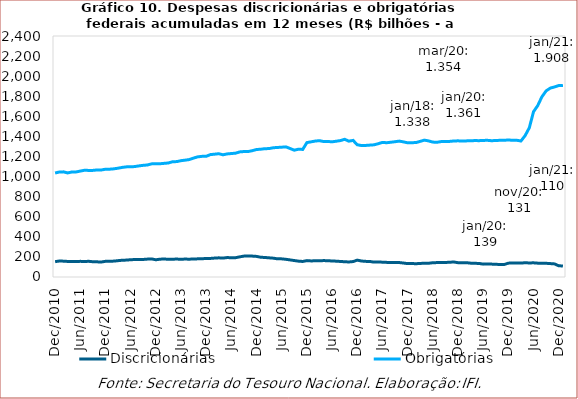
| Category | Discricionárias | Obrigatórias |
|---|---|---|
| 2010-12-01 | 152493.078 | 1035611.279 |
| 2011-01-01 | 159361.347 | 1045466.51 |
| 2011-02-01 | 157772.282 | 1047000.914 |
| 2011-03-01 | 154988.34 | 1036507.236 |
| 2011-04-01 | 155411.719 | 1045882.444 |
| 2011-05-01 | 153684.758 | 1046263.709 |
| 2011-06-01 | 155844.777 | 1054910.131 |
| 2011-07-01 | 154352.519 | 1062718.355 |
| 2011-08-01 | 156264.738 | 1061507.962 |
| 2011-09-01 | 151985.253 | 1061675.842 |
| 2011-10-01 | 150957.055 | 1066053.446 |
| 2011-11-01 | 149219.391 | 1065449.513 |
| 2011-12-01 | 156296.456 | 1073489.223 |
| 2012-01-01 | 157255.637 | 1073674.89 |
| 2012-02-01 | 158217.53 | 1077167.106 |
| 2012-03-01 | 162676.42 | 1083446.814 |
| 2012-04-01 | 166902.656 | 1091550.693 |
| 2012-05-01 | 168341.866 | 1096842.513 |
| 2012-06-01 | 172020.942 | 1097212.478 |
| 2012-07-01 | 174046.364 | 1099840.94 |
| 2012-08-01 | 175037.639 | 1106603.985 |
| 2012-09-01 | 174729.711 | 1112021.899 |
| 2012-10-01 | 178167.072 | 1115761.085 |
| 2012-11-01 | 180190.611 | 1126600.033 |
| 2012-12-01 | 171610.037 | 1126668.014 |
| 2013-01-01 | 177393.075 | 1127914.118 |
| 2013-02-01 | 179446.379 | 1131786.408 |
| 2013-03-01 | 176042.849 | 1135689.229 |
| 2013-04-01 | 177418.997 | 1147931.016 |
| 2013-05-01 | 178486.377 | 1149229.244 |
| 2013-06-01 | 176769.881 | 1158483.89 |
| 2013-07-01 | 178600.591 | 1163665.494 |
| 2013-08-01 | 177329.815 | 1169685.257 |
| 2013-09-01 | 179660.759 | 1184481.561 |
| 2013-10-01 | 180677.71 | 1196709.253 |
| 2013-11-01 | 182110.259 | 1201426.099 |
| 2013-12-01 | 184118.512 | 1201795.875 |
| 2014-01-01 | 184882.54 | 1218985.435 |
| 2014-02-01 | 188479.526 | 1222987.188 |
| 2014-03-01 | 190788.251 | 1227545.058 |
| 2014-04-01 | 188549.096 | 1217009.808 |
| 2014-05-01 | 193561.09 | 1225624.041 |
| 2014-06-01 | 191831.298 | 1229446.183 |
| 2014-07-01 | 192482.173 | 1233089.87 |
| 2014-08-01 | 200764.952 | 1245831.885 |
| 2014-09-01 | 207888.291 | 1249446.674 |
| 2014-10-01 | 208474.059 | 1249594.489 |
| 2014-11-01 | 208084.839 | 1258131.577 |
| 2014-12-01 | 205151.903 | 1269584.343 |
| 2015-01-01 | 196693.267 | 1272368.092 |
| 2015-02-01 | 194304.511 | 1277905.287 |
| 2015-03-01 | 190862.755 | 1278848.919 |
| 2015-04-01 | 187517.102 | 1287211.532 |
| 2015-05-01 | 180905.173 | 1290063.781 |
| 2015-06-01 | 180512.281 | 1292767.999 |
| 2015-07-01 | 176312.271 | 1295859.857 |
| 2015-08-01 | 170151.429 | 1279608.895 |
| 2015-09-01 | 163711.776 | 1262648.181 |
| 2015-10-01 | 157811.914 | 1272912.369 |
| 2015-11-01 | 154748.477 | 1270338.719 |
| 2015-12-01 | 163198.564 | 1338455.826 |
| 2016-01-01 | 160189.151 | 1346033.944 |
| 2016-02-01 | 161222.291 | 1353785.99 |
| 2016-03-01 | 161347.554 | 1357665.365 |
| 2016-04-01 | 163491.412 | 1348828.399 |
| 2016-05-01 | 161939.579 | 1349523.096 |
| 2016-06-01 | 159600.888 | 1346313.987 |
| 2016-07-01 | 157643.081 | 1352373.142 |
| 2016-08-01 | 154775.481 | 1358535.29 |
| 2016-09-01 | 151854.93 | 1371460.716 |
| 2016-10-01 | 149809.693 | 1352555.736 |
| 2016-11-01 | 153647.855 | 1360372.963 |
| 2016-12-01 | 167704.843 | 1317148.731 |
| 2017-01-01 | 159096.618 | 1309003.336 |
| 2017-02-01 | 155694.532 | 1310138.762 |
| 2017-03-01 | 154485.984 | 1313483.545 |
| 2017-04-01 | 148237.999 | 1316237.311 |
| 2017-05-01 | 149123.925 | 1327415.808 |
| 2017-06-01 | 147814.637 | 1340471.242 |
| 2017-07-01 | 145641.095 | 1337141.482 |
| 2017-08-01 | 145402.246 | 1341982.796 |
| 2017-09-01 | 144549.956 | 1347246.439 |
| 2017-10-01 | 143794.786 | 1353184.796 |
| 2017-11-01 | 138996.002 | 1345668.118 |
| 2017-12-01 | 133452.992 | 1336328.094 |
| 2018-01-01 | 133934.731 | 1337759.638 |
| 2018-02-01 | 132476.088 | 1338577.609 |
| 2018-03-01 | 134669.899 | 1350730.396 |
| 2018-04-01 | 137802.22 | 1362986.37 |
| 2018-05-01 | 136899.41 | 1355086.034 |
| 2018-06-01 | 142060.347 | 1343446.351 |
| 2018-07-01 | 143448.771 | 1341825.247 |
| 2018-08-01 | 143618.57 | 1348581.299 |
| 2018-09-01 | 144610.42 | 1349785.261 |
| 2018-10-01 | 146968.841 | 1350366.394 |
| 2018-11-01 | 149446.342 | 1354420.614 |
| 2018-12-01 | 142462.869 | 1355982.242 |
| 2019-01-01 | 141833.602 | 1353862.596 |
| 2019-02-01 | 142694.68 | 1355530.99 |
| 2019-03-01 | 137865.936 | 1356222.932 |
| 2019-04-01 | 135949.954 | 1358765.117 |
| 2019-05-01 | 135356.583 | 1357701.145 |
| 2019-06-01 | 128202.515 | 1359972.597 |
| 2019-07-01 | 129641.29 | 1361245.464 |
| 2019-08-01 | 128397.993 | 1357109.053 |
| 2019-09-01 | 126478.275 | 1359405.27 |
| 2019-10-01 | 124667.472 | 1361191.236 |
| 2019-11-01 | 124094.458 | 1360757.198 |
| 2019-12-01 | 138032.351 | 1365380.219 |
| 2020-01-01 | 138771.611 | 1360746.717 |
| 2020-02-01 | 138348.031 | 1361693.783 |
| 2020-03-01 | 139099.292 | 1354241.031 |
| 2020-04-01 | 141760.647 | 1408107.948 |
| 2020-05-01 | 140041.817 | 1486581.538 |
| 2020-06-01 | 141119.068 | 1646020.915 |
| 2020-07-01 | 137915.919 | 1706790.038 |
| 2020-08-01 | 137664.705 | 1794933.339 |
| 2020-09-01 | 136491.88 | 1853432.429 |
| 2020-10-01 | 133490.723 | 1881498.535 |
| 2020-11-01 | 130504.465 | 1892461.399 |
| 2020-12-01 | 111690.329 | 1906685.114 |
| 2021-01-01 | 109774.142 | 1908204.47 |